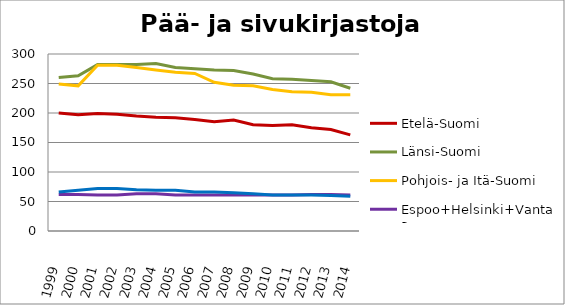
| Category | Etelä-Suomi | Länsi-Suomi | Pohjois- ja Itä-Suomi | Espoo+Helsinki+Vantaa | Muu Uusimaa |
|---|---|---|---|---|---|
| 1999.0 | 200 | 260 | 249 | 62 | 66 |
| 2000.0 | 197 | 263 | 246 | 62 | 69 |
| 2001.0 | 199 | 282 | 281 | 61 | 72 |
| 2002.0 | 198 | 282 | 281 | 61 | 72 |
| 2003.0 | 195 | 282 | 277 | 63 | 70 |
| 2004.0 | 193 | 284 | 273 | 63 | 69 |
| 2005.0 | 192 | 277 | 269 | 61 | 69 |
| 2006.0 | 189 | 275 | 267 | 61 | 66 |
| 2007.0 | 185 | 273 | 252 | 61 | 66 |
| 2008.0 | 188 | 272 | 247 | 61 | 65 |
| 2009.0 | 180 | 266 | 246 | 61 | 63 |
| 2010.0 | 179 | 258 | 240 | 61 | 61 |
| 2011.0 | 180 | 257 | 236 | 61 | 61 |
| 2012.0 | 175 | 255 | 235 | 62 | 61 |
| 2013.0 | 172 | 253 | 231 | 62 | 60 |
| 2014.0 | 163 | 242 | 231 | 61 | 59 |